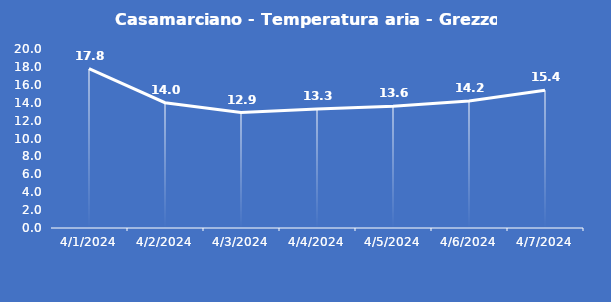
| Category | Casamarciano - Temperatura aria - Grezzo (°C) |
|---|---|
| 4/1/24 | 17.8 |
| 4/2/24 | 14 |
| 4/3/24 | 12.9 |
| 4/4/24 | 13.3 |
| 4/5/24 | 13.6 |
| 4/6/24 | 14.2 |
| 4/7/24 | 15.4 |